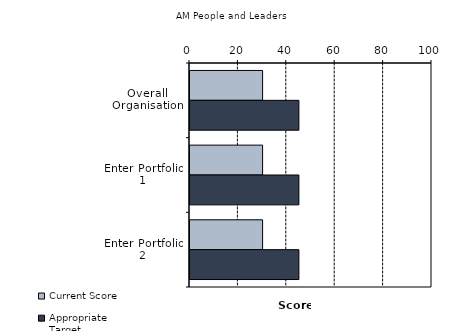
| Category | Current Score | Appropriate Target |
|---|---|---|
| Overall Organisation | 30 | 45 |
| Enter Portfolio 1 | 30 | 45 |
| Enter Portfolio 2 | 30 | 45 |